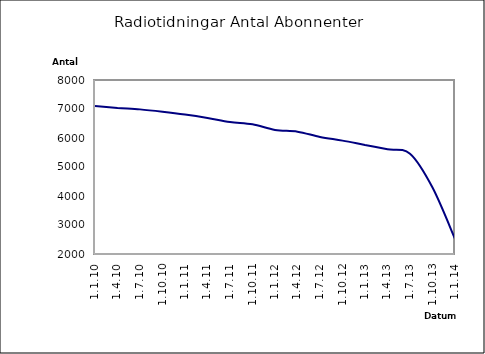
| Category | Series 0 |
|---|---|
| 1.1.10 | 7102 |
| 1.4.10 | 7038 |
| 1.7.10 | 6987 |
| 1.10.10 | 6906 |
| 1.1.11 | 6810 |
| 1.4.11 | 6692 |
| 1.7.11 | 6554 |
| 1.10.11 | 6473 |
| 1.1.12 | 6279 |
| 1.4.12 | 6218 |
| 1.7.12 | 6037 |
| 1.10.12 | 5909 |
| 1.1.13 | 5759 |
| 1.4.13 | 5612 |
| 1.7.13 | 5457 |
| 1.10.13 | 4291 |
| 1.1.14 | 2523 |